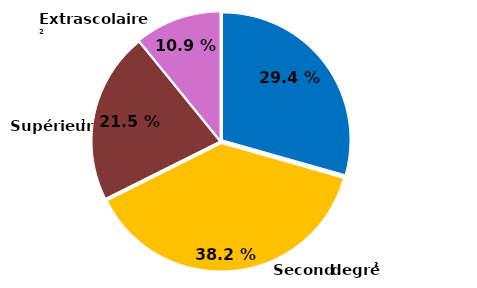
| Category | Series 0 |
|---|---|
| Premier degré | 0.294 |
| Second degré | 0.382 |
| Supérieur | 0.215 |
| Extrascolaire | 0.109 |